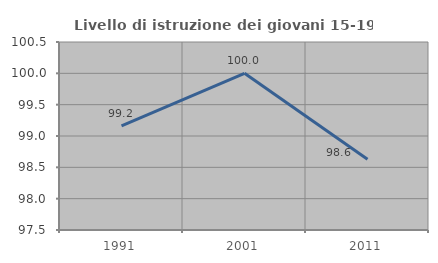
| Category | Livello di istruzione dei giovani 15-19 anni |
|---|---|
| 1991.0 | 99.16 |
| 2001.0 | 100 |
| 2011.0 | 98.63 |